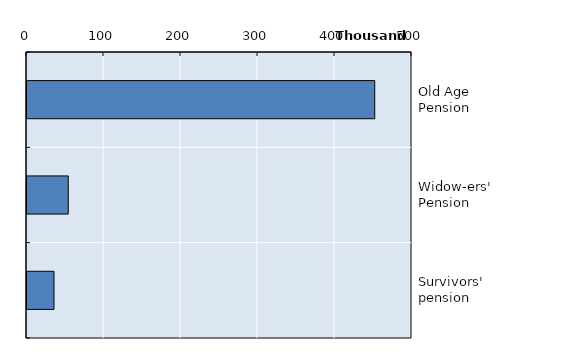
| Category | Series 0 |
|---|---|
| Old Age Pension | 451584 |
| Widow-ers' Pension | 53558 |
| Survivors' pension | 35027 |